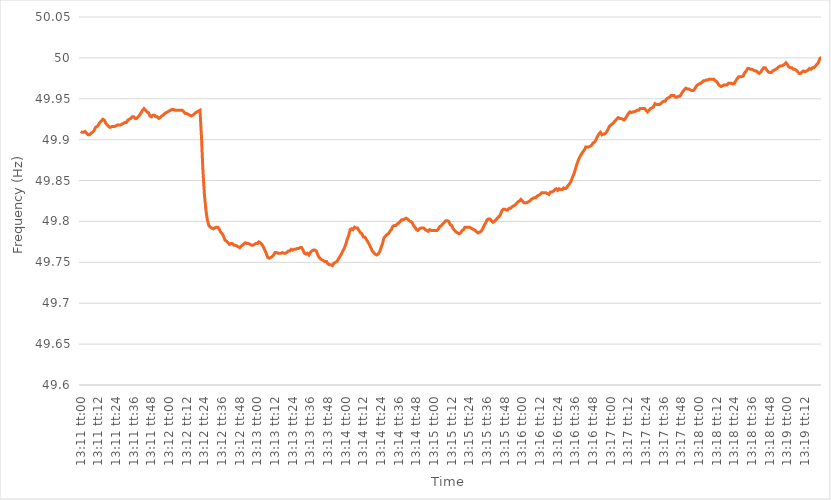
| Category | Series 0 |
|---|---|
| 0.5493055555555556 | 49.91 |
| 0.5493171296296296 | 49.909 |
| 0.5493287037037037 | 49.909 |
| 0.5493402777777777 | 49.91 |
| 0.5493518518518519 | 49.908 |
| 0.5493634259259259 | 49.906 |
| 0.5493750000000001 | 49.906 |
| 0.5493865740740741 | 49.908 |
| 0.5493981481481481 | 49.909 |
| 0.5494097222222222 | 49.911 |
| 0.5494212962962963 | 49.915 |
| 0.5494328703703704 | 49.916 |
| 0.5494444444444445 | 49.918 |
| 0.5494560185185186 | 49.921 |
| 0.5494675925925926 | 49.923 |
| 0.5494791666666666 | 49.925 |
| 0.5494907407407407 | 49.924 |
| 0.5495023148148148 | 49.92 |
| 0.5495138888888889 | 49.918 |
| 0.549525462962963 | 49.916 |
| 0.549537037037037 | 49.915 |
| 0.5495486111111111 | 49.916 |
| 0.5495601851851851 | 49.916 |
| 0.5495717592592593 | 49.916 |
| 0.5495833333333333 | 49.917 |
| 0.5495949074074075 | 49.918 |
| 0.5496064814814815 | 49.918 |
| 0.5496180555555555 | 49.918 |
| 0.5496296296296296 | 49.919 |
| 0.5496412037037037 | 49.92 |
| 0.5496527777777778 | 49.921 |
| 0.5496643518518519 | 49.921 |
| 0.549675925925926 | 49.924 |
| 0.5496875 | 49.925 |
| 0.549699074074074 | 49.926 |
| 0.5497106481481482 | 49.928 |
| 0.5497222222222222 | 49.928 |
| 0.5497337962962963 | 49.926 |
| 0.5497453703703704 | 49.926 |
| 0.5497569444444445 | 49.928 |
| 0.5497685185185185 | 49.93 |
| 0.5497800925925925 | 49.933 |
| 0.5497916666666667 | 49.936 |
| 0.5498032407407407 | 49.938 |
| 0.5498148148148149 | 49.936 |
| 0.5498263888888889 | 49.934 |
| 0.549837962962963 | 49.933 |
| 0.549849537037037 | 49.929 |
| 0.5498611111111111 | 49.928 |
| 0.5498726851851852 | 49.93 |
| 0.5498842592592593 | 49.93 |
| 0.5498958333333334 | 49.928 |
| 0.5499074074074074 | 49.928 |
| 0.5499189814814814 | 49.926 |
| 0.5499305555555556 | 49.927 |
| 0.5499421296296296 | 49.929 |
| 0.5499537037037037 | 49.93 |
| 0.5499652777777778 | 49.932 |
| 0.5499768518518519 | 49.933 |
| 0.5499884259259259 | 49.934 |
| 0.5499999999999999 | 49.935 |
| 0.5500115740740741 | 49.936 |
| 0.5500231481481481 | 49.937 |
| 0.5500347222222223 | 49.937 |
| 0.5500462962962963 | 49.936 |
| 0.5500578703703703 | 49.936 |
| 0.5500694444444444 | 49.936 |
| 0.5500810185185185 | 49.936 |
| 0.5500925925925926 | 49.936 |
| 0.5501041666666667 | 49.936 |
| 0.5501157407407408 | 49.934 |
| 0.5501273148148148 | 49.932 |
| 0.5501388888888888 | 49.932 |
| 0.550150462962963 | 49.931 |
| 0.550162037037037 | 49.93 |
| 0.5501736111111112 | 49.929 |
| 0.5501851851851852 | 49.93 |
| 0.5501967592592593 | 49.931 |
| 0.5502083333333333 | 49.933 |
| 0.5502199074074073 | 49.934 |
| 0.5502314814814815 | 49.935 |
| 0.5502430555555555 | 49.936 |
| 0.5502546296296297 | 49.904 |
| 0.5502662037037037 | 49.862 |
| 0.5502777777777778 | 49.833 |
| 0.5502893518518518 | 49.814 |
| 0.5503009259259259 | 49.802 |
| 0.5503125 | 49.795 |
| 0.5503240740740741 | 49.793 |
| 0.5503356481481482 | 49.792 |
| 0.5503472222222222 | 49.791 |
| 0.5503587962962962 | 49.792 |
| 0.5503703703703704 | 49.793 |
| 0.5503819444444444 | 49.793 |
| 0.5503935185185186 | 49.791 |
| 0.5504050925925926 | 49.787 |
| 0.5504166666666667 | 49.785 |
| 0.5504282407407407 | 49.782 |
| 0.5504398148148147 | 49.777 |
| 0.5504513888888889 | 49.776 |
| 0.5504629629629629 | 49.774 |
| 0.5504745370370371 | 49.772 |
| 0.5504861111111111 | 49.773 |
| 0.5504976851851852 | 49.773 |
| 0.5505092592592592 | 49.771 |
| 0.5505208333333333 | 49.771 |
| 0.5505324074074074 | 49.77 |
| 0.5505439814814815 | 49.769 |
| 0.5505555555555556 | 49.768 |
| 0.5505671296296296 | 49.77 |
| 0.5505787037037037 | 49.771 |
| 0.5505902777777778 | 49.773 |
| 0.5506018518518518 | 49.774 |
| 0.550613425925926 | 49.773 |
| 0.550625 | 49.773 |
| 0.5506365740740741 | 49.772 |
| 0.5506481481481481 | 49.771 |
| 0.5506597222222221 | 49.771 |
| 0.5506712962962963 | 49.772 |
| 0.5506828703703703 | 49.773 |
| 0.5506944444444445 | 49.773 |
| 0.5507060185185185 | 49.775 |
| 0.5507175925925926 | 49.774 |
| 0.5507291666666666 | 49.772 |
| 0.5507407407407408 | 49.769 |
| 0.5507523148148148 | 49.765 |
| 0.5507638888888889 | 49.761 |
| 0.550775462962963 | 49.756 |
| 0.550787037037037 | 49.755 |
| 0.5507986111111111 | 49.756 |
| 0.5508101851851852 | 49.757 |
| 0.5508217592592592 | 49.759 |
| 0.5508333333333334 | 49.762 |
| 0.5508449074074074 | 49.762 |
| 0.5508564814814815 | 49.761 |
| 0.5508680555555555 | 49.761 |
| 0.5508796296296297 | 49.761 |
| 0.5508912037037037 | 49.762 |
| 0.5509027777777779 | 49.761 |
| 0.5509143518518519 | 49.761 |
| 0.5509259259259259 | 49.762 |
| 0.5509375 | 49.764 |
| 0.550949074074074 | 49.764 |
| 0.5509606481481482 | 49.766 |
| 0.5509722222222222 | 49.765 |
| 0.5509837962962963 | 49.766 |
| 0.5509953703703704 | 49.766 |
| 0.5510069444444444 | 49.767 |
| 0.5510185185185185 | 49.767 |
| 0.5510300925925926 | 49.768 |
| 0.5510416666666667 | 49.768 |
| 0.5510532407407408 | 49.765 |
| 0.5510648148148148 | 49.761 |
| 0.5510763888888889 | 49.76 |
| 0.5510879629629629 | 49.761 |
| 0.5510995370370371 | 49.759 |
| 0.5511111111111111 | 49.762 |
| 0.5511226851851853 | 49.764 |
| 0.5511342592592593 | 49.765 |
| 0.5511458333333333 | 49.765 |
| 0.5511574074074074 | 49.764 |
| 0.5511689814814814 | 49.759 |
| 0.5511805555555556 | 49.756 |
| 0.5511921296296296 | 49.754 |
| 0.5512037037037038 | 49.753 |
| 0.5512152777777778 | 49.752 |
| 0.5512268518518518 | 49.751 |
| 0.5512384259259259 | 49.751 |
| 0.55125 | 49.748 |
| 0.5512615740740741 | 49.747 |
| 0.5512731481481482 | 49.747 |
| 0.5512847222222222 | 49.746 |
| 0.5512962962962963 | 49.749 |
| 0.5513078703703703 | 49.75 |
| 0.5513194444444445 | 49.751 |
| 0.5513310185185185 | 49.754 |
| 0.5513425925925927 | 49.757 |
| 0.5513541666666667 | 49.76 |
| 0.5513657407407407 | 49.764 |
| 0.5513773148148148 | 49.767 |
| 0.5513888888888888 | 49.772 |
| 0.551400462962963 | 49.778 |
| 0.551412037037037 | 49.783 |
| 0.5514236111111112 | 49.79 |
| 0.5514351851851852 | 49.791 |
| 0.5514467592592592 | 49.79 |
| 0.5514583333333333 | 49.793 |
| 0.5514699074074074 | 49.792 |
| 0.5514814814814815 | 49.792 |
| 0.5514930555555556 | 49.789 |
| 0.5515046296296297 | 49.786 |
| 0.5515162037037037 | 49.785 |
| 0.5515277777777777 | 49.781 |
| 0.5515393518518519 | 49.781 |
| 0.5515509259259259 | 49.778 |
| 0.5515625000000001 | 49.775 |
| 0.5515740740740741 | 49.772 |
| 0.5515856481481481 | 49.768 |
| 0.5515972222222222 | 49.764 |
| 0.5516087962962963 | 49.762 |
| 0.5516203703703704 | 49.76 |
| 0.5516319444444444 | 49.759 |
| 0.5516435185185186 | 49.76 |
| 0.5516550925925926 | 49.763 |
| 0.5516666666666666 | 49.768 |
| 0.5516782407407407 | 49.773 |
| 0.5516898148148148 | 49.78 |
| 0.5517013888888889 | 49.782 |
| 0.551712962962963 | 49.784 |
| 0.551724537037037 | 49.785 |
| 0.5517361111111111 | 49.788 |
| 0.5517476851851851 | 49.79 |
| 0.5517592592592593 | 49.794 |
| 0.5517708333333333 | 49.795 |
| 0.5517824074074075 | 49.795 |
| 0.5517939814814815 | 49.797 |
| 0.5518055555555555 | 49.798 |
| 0.5518171296296296 | 49.8 |
| 0.5518287037037037 | 49.802 |
| 0.5518402777777778 | 49.802 |
| 0.5518518518518518 | 49.803 |
| 0.551863425925926 | 49.804 |
| 0.551875 | 49.803 |
| 0.551886574074074 | 49.801 |
| 0.5518981481481481 | 49.8 |
| 0.5519097222222222 | 49.799 |
| 0.5519212962962963 | 49.795 |
| 0.5519328703703704 | 49.793 |
| 0.5519444444444445 | 49.79 |
| 0.5519560185185185 | 49.789 |
| 0.5519675925925925 | 49.791 |
| 0.5519791666666667 | 49.792 |
| 0.5519907407407407 | 49.792 |
| 0.5520023148148149 | 49.792 |
| 0.5520138888888889 | 49.79 |
| 0.552025462962963 | 49.789 |
| 0.552037037037037 | 49.788 |
| 0.5520486111111111 | 49.79 |
| 0.5520601851851852 | 49.789 |
| 0.5520717592592593 | 49.789 |
| 0.5520833333333334 | 49.789 |
| 0.5520949074074074 | 49.789 |
| 0.5521064814814814 | 49.789 |
| 0.5521180555555555 | 49.791 |
| 0.5521296296296296 | 49.794 |
| 0.5521412037037037 | 49.795 |
| 0.5521527777777778 | 49.797 |
| 0.5521643518518519 | 49.799 |
| 0.5521759259259259 | 49.801 |
| 0.5521874999999999 | 49.801 |
| 0.5521990740740741 | 49.8 |
| 0.5522106481481481 | 49.796 |
| 0.5522222222222223 | 49.795 |
| 0.5522337962962963 | 49.791 |
| 0.5522453703703704 | 49.789 |
| 0.5522569444444444 | 49.787 |
| 0.5522685185185185 | 49.786 |
| 0.5522800925925926 | 49.785 |
| 0.5522916666666667 | 49.786 |
| 0.5523032407407408 | 49.789 |
| 0.5523148148148148 | 49.79 |
| 0.5523263888888889 | 49.793 |
| 0.5523379629629629 | 49.793 |
| 0.552349537037037 | 49.793 |
| 0.5523611111111111 | 49.793 |
| 0.5523726851851852 | 49.792 |
| 0.5523842592592593 | 49.791 |
| 0.5523958333333333 | 49.79 |
| 0.5524074074074073 | 49.789 |
| 0.5524189814814815 | 49.787 |
| 0.5524305555555555 | 49.786 |
| 0.5524421296296297 | 49.787 |
| 0.5524537037037037 | 49.788 |
| 0.5524652777777778 | 49.791 |
| 0.5524768518518518 | 49.795 |
| 0.552488425925926 | 49.798 |
| 0.5525 | 49.802 |
| 0.5525115740740741 | 49.803 |
| 0.5525231481481482 | 49.803 |
| 0.5525347222222222 | 49.801 |
| 0.5525462962962963 | 49.799 |
| 0.5525578703703703 | 49.8 |
| 0.5525694444444444 | 49.802 |
| 0.5525810185185185 | 49.804 |
| 0.5525925925925926 | 49.806 |
| 0.5526041666666667 | 49.808 |
| 0.5526157407407407 | 49.813 |
| 0.5526273148148148 | 49.815 |
| 0.5526388888888889 | 49.815 |
| 0.5526504629629629 | 49.814 |
| 0.5526620370370371 | 49.814 |
| 0.5526736111111111 | 49.816 |
| 0.5526851851851852 | 49.816 |
| 0.5526967592592592 | 49.818 |
| 0.5527083333333334 | 49.819 |
| 0.5527199074074074 | 49.82 |
| 0.5527314814814815 | 49.822 |
| 0.5527430555555556 | 49.824 |
| 0.5527546296296296 | 49.825 |
| 0.5527662037037037 | 49.827 |
| 0.5527777777777778 | 49.825 |
| 0.5527893518518519 | 49.823 |
| 0.552800925925926 | 49.823 |
| 0.5528125 | 49.823 |
| 0.5528240740740741 | 49.824 |
| 0.5528356481481481 | 49.825 |
| 0.5528472222222222 | 49.827 |
| 0.5528587962962963 | 49.828 |
| 0.5528703703703703 | 49.829 |
| 0.5528819444444445 | 49.829 |
| 0.5528935185185185 | 49.831 |
| 0.5529050925925926 | 49.832 |
| 0.5529166666666666 | 49.833 |
| 0.5529282407407408 | 49.835 |
| 0.5529398148148148 | 49.835 |
| 0.552951388888889 | 49.835 |
| 0.552962962962963 | 49.835 |
| 0.552974537037037 | 49.834 |
| 0.5529861111111111 | 49.833 |
| 0.5529976851851852 | 49.836 |
| 0.5530092592592593 | 49.836 |
| 0.5530208333333334 | 49.837 |
| 0.5530324074074074 | 49.839 |
| 0.5530439814814815 | 49.84 |
| 0.5530555555555555 | 49.838 |
| 0.5530671296296296 | 49.84 |
| 0.5530787037037037 | 49.839 |
| 0.5530902777777778 | 49.839 |
| 0.5531018518518519 | 49.841 |
| 0.5531134259259259 | 49.84 |
| 0.553125 | 49.841 |
| 0.553136574074074 | 49.844 |
| 0.5531481481481482 | 49.846 |
| 0.5531597222222222 | 49.849 |
| 0.5531712962962964 | 49.854 |
| 0.5531828703703704 | 49.858 |
| 0.5531944444444444 | 49.864 |
| 0.5532060185185185 | 49.87 |
| 0.5532175925925926 | 49.875 |
| 0.5532291666666667 | 49.879 |
| 0.5532407407407408 | 49.882 |
| 0.5532523148148148 | 49.885 |
| 0.5532638888888889 | 49.887 |
| 0.5532754629629629 | 49.891 |
| 0.553287037037037 | 49.891 |
| 0.5532986111111111 | 49.891 |
| 0.5533101851851852 | 49.892 |
| 0.5533217592592593 | 49.893 |
| 0.5533333333333333 | 49.896 |
| 0.5533449074074074 | 49.897 |
| 0.5533564814814814 | 49.9 |
| 0.5533680555555556 | 49.904 |
| 0.5533796296296296 | 49.907 |
| 0.5533912037037038 | 49.909 |
| 0.5534027777777778 | 49.906 |
| 0.5534143518518518 | 49.907 |
| 0.5534259259259259 | 49.907 |
| 0.5534375 | 49.909 |
| 0.5534490740740741 | 49.912 |
| 0.5534606481481482 | 49.916 |
| 0.5534722222222223 | 49.918 |
| 0.5534837962962963 | 49.919 |
| 0.5534953703703703 | 49.921 |
| 0.5535069444444445 | 49.923 |
| 0.5535185185185185 | 49.925 |
| 0.5535300925925926 | 49.927 |
| 0.5535416666666667 | 49.926 |
| 0.5535532407407407 | 49.926 |
| 0.5535648148148148 | 49.925 |
| 0.5535763888888888 | 49.924 |
| 0.553587962962963 | 49.926 |
| 0.553599537037037 | 49.929 |
| 0.5536111111111112 | 49.932 |
| 0.5536226851851852 | 49.934 |
| 0.5536342592592592 | 49.933 |
| 0.5536458333333333 | 49.934 |
| 0.5536574074074074 | 49.934 |
| 0.5536689814814815 | 49.935 |
| 0.5536805555555556 | 49.936 |
| 0.5536921296296297 | 49.936 |
| 0.5537037037037037 | 49.938 |
| 0.5537152777777777 | 49.938 |
| 0.5537268518518519 | 49.938 |
| 0.5537384259259259 | 49.938 |
| 0.55375 | 49.936 |
| 0.5537615740740741 | 49.934 |
| 0.5537731481481482 | 49.936 |
| 0.5537847222222222 | 49.938 |
| 0.5537962962962962 | 49.939 |
| 0.5538078703703704 | 49.94 |
| 0.5538194444444444 | 49.944 |
| 0.5538310185185186 | 49.943 |
| 0.5538425925925926 | 49.943 |
| 0.5538541666666666 | 49.943 |
| 0.5538657407407407 | 49.944 |
| 0.5538773148148148 | 49.946 |
| 0.5538888888888889 | 49.947 |
| 0.553900462962963 | 49.947 |
| 0.5539120370370371 | 49.95 |
| 0.5539236111111111 | 49.951 |
| 0.5539351851851851 | 49.952 |
| 0.5539467592592593 | 49.954 |
| 0.5539583333333333 | 49.954 |
| 0.5539699074074074 | 49.954 |
| 0.5539814814814815 | 49.952 |
| 0.5539930555555556 | 49.952 |
| 0.5540046296296296 | 49.953 |
| 0.5540162037037036 | 49.953 |
| 0.5540277777777778 | 49.956 |
| 0.5540393518518518 | 49.959 |
| 0.554050925925926 | 49.961 |
| 0.5540625 | 49.963 |
| 0.554074074074074 | 49.962 |
| 0.5540856481481481 | 49.962 |
| 0.5540972222222222 | 49.961 |
| 0.5541087962962963 | 49.96 |
| 0.5541203703703704 | 49.96 |
| 0.5541319444444445 | 49.962 |
| 0.5541435185185185 | 49.965 |
| 0.5541550925925925 | 49.967 |
| 0.5541666666666667 | 49.968 |
| 0.5541782407407407 | 49.969 |
| 0.5541898148148149 | 49.97 |
| 0.5542013888888889 | 49.972 |
| 0.554212962962963 | 49.972 |
| 0.554224537037037 | 49.973 |
| 0.554236111111111 | 49.973 |
| 0.5542476851851852 | 49.974 |
| 0.5542592592592592 | 49.974 |
| 0.5542708333333334 | 49.974 |
| 0.5542824074074074 | 49.974 |
| 0.5542939814814815 | 49.972 |
| 0.5543055555555555 | 49.971 |
| 0.5543171296296296 | 49.968 |
| 0.5543287037037037 | 49.966 |
| 0.5543402777777778 | 49.965 |
| 0.5543518518518519 | 49.966 |
| 0.5543634259259259 | 49.967 |
| 0.554375 | 49.967 |
| 0.5543865740740741 | 49.967 |
| 0.5543981481481481 | 49.969 |
| 0.5544097222222223 | 49.969 |
| 0.5544212962962963 | 49.969 |
| 0.5544328703703704 | 49.968 |
| 0.5544444444444444 | 49.969 |
| 0.5544560185185184 | 49.972 |
| 0.5544675925925926 | 49.975 |
| 0.5544791666666666 | 49.977 |
| 0.5544907407407408 | 49.977 |
| 0.5545023148148148 | 49.977 |
| 0.5545138888888889 | 49.978 |
| 0.5545254629629629 | 49.982 |
| 0.554537037037037 | 49.984 |
| 0.5545486111111111 | 49.987 |
| 0.5545601851851852 | 49.987 |
| 0.5545717592592593 | 49.986 |
| 0.5545833333333333 | 49.986 |
| 0.5545949074074074 | 49.985 |
| 0.5546064814814815 | 49.984 |
| 0.5546180555555555 | 49.984 |
| 0.5546296296296297 | 49.982 |
| 0.5546412037037037 | 49.981 |
| 0.5546527777777778 | 49.983 |
| 0.5546643518518518 | 49.986 |
| 0.554675925925926 | 49.988 |
| 0.5546875 | 49.988 |
| 0.554699074074074 | 49.985 |
| 0.5547106481481482 | 49.983 |
| 0.5547222222222222 | 49.982 |
| 0.5547337962962963 | 49.982 |
| 0.5547453703703703 | 49.984 |
| 0.5547569444444445 | 49.985 |
| 0.5547685185185185 | 49.986 |
| 0.5547800925925926 | 49.987 |
| 0.5547916666666667 | 49.989 |
| 0.5548032407407407 | 49.99 |
| 0.5548148148148148 | 49.99 |
| 0.5548263888888889 | 49.991 |
| 0.554837962962963 | 49.992 |
| 0.5548495370370371 | 49.994 |
| 0.5548611111111111 | 49.992 |
| 0.5548726851851852 | 49.989 |
| 0.5548842592592592 | 49.988 |
| 0.5548958333333334 | 49.988 |
| 0.5549074074074074 | 49.986 |
| 0.5549189814814816 | 49.986 |
| 0.5549305555555556 | 49.985 |
| 0.5549421296296296 | 49.983 |
| 0.5549537037037037 | 49.981 |
| 0.5549652777777777 | 49.981 |
| 0.5549768518518519 | 49.983 |
| 0.5549884259259259 | 49.984 |
| 0.555 | 49.983 |
| 0.5550115740740741 | 49.984 |
| 0.5550231481481481 | 49.985 |
| 0.5550347222222222 | 49.987 |
| 0.5550462962962963 | 49.986 |
| 0.5550578703703704 | 49.988 |
| 0.5550694444444445 | 49.988 |
| 0.5550810185185185 | 49.99 |
| 0.5550925925925926 | 49.992 |
| 0.5551041666666666 | 49.994 |
| 0.5551157407407408 | 49.999 |
| 0.5551273148148148 | 50.001 |